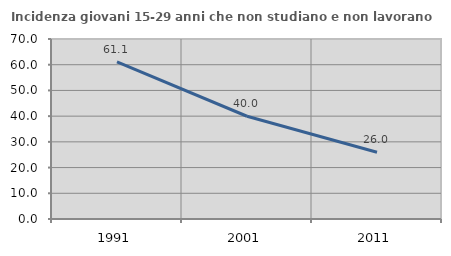
| Category | Incidenza giovani 15-29 anni che non studiano e non lavorano  |
|---|---|
| 1991.0 | 61.082 |
| 2001.0 | 39.956 |
| 2011.0 | 25.984 |